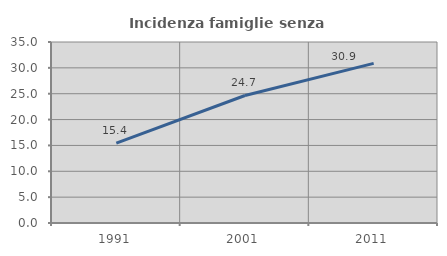
| Category | Incidenza famiglie senza nuclei |
|---|---|
| 1991.0 | 15.436 |
| 2001.0 | 24.658 |
| 2011.0 | 30.858 |